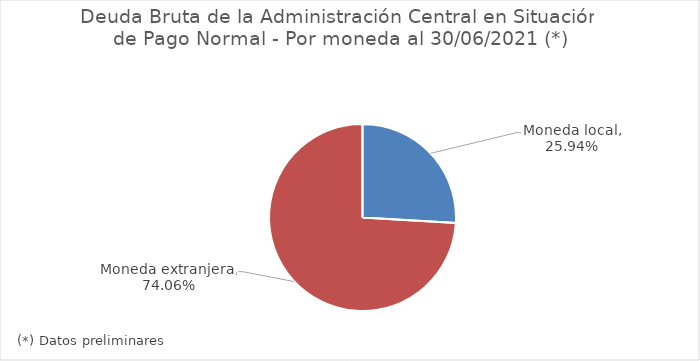
| Category | Series 0 |
|---|---|
| Moneda local | 0.259 |
| Moneda extranjera | 0.741 |